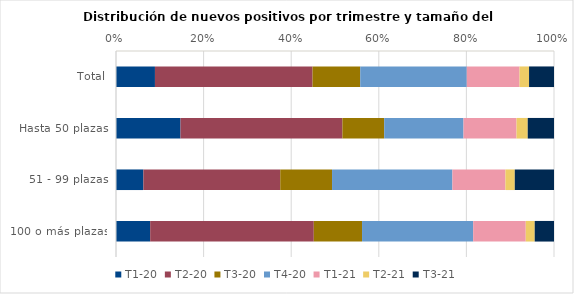
| Category | T1-20 | T2-20 | T3-20 | T4-20 | T1-21 | T2-21 | T3-21 |
|---|---|---|---|---|---|---|---|
| Total | 8.893 | 35.979 | 10.887 | 24.329 | 12.045 | 2.173 | 5.694 |
| Hasta 50 plazas | 14.726 | 36.962 | 9.546 | 18.102 | 12.107 | 2.561 | 5.995 |
| 51 - 99 plazas | 6.25 | 31.25 | 11.824 | 27.477 | 12.106 | 2.14 | 8.953 |
| 100 o más plazas | 7.803 | 37.354 | 11.018 | 25.374 | 12.001 | 2.048 | 4.403 |